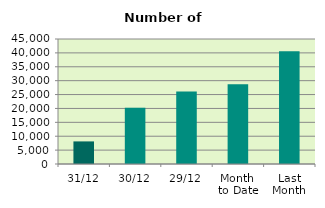
| Category | Series 0 |
|---|---|
| 31/12 | 8134 |
| 30/12 | 20268 |
| 29/12 | 26088 |
| Month 
to Date | 28724.435 |
| Last
Month | 40546.091 |